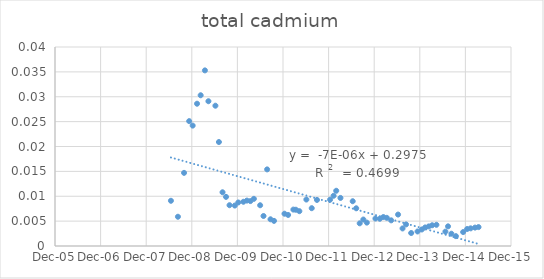
| Category | Series 0 |
|---|---|
| 39618.0 | 0.009 |
| 39674.0 | 0.006 |
| 39723.0 | 0.015 |
| 39764.0 | 0.025 |
| 39792.0 | 0.024 |
| 39827.0 | 0.029 |
| 39856.0 | 0.03 |
| 39890.0 | 0.035 |
| 39918.0 | 0.029 |
| 39974.0 | 0.028 |
| 40002.0 | 0.021 |
| 40031.0 | 0.011 |
| 40059.0 | 0.01 |
| 40087.0 | 0.008 |
| 40129.0 | 0.008 |
| 40157.0 | 0.009 |
| 40198.0 | 0.009 |
| 40226.0 | 0.009 |
| 40282.0 | 0.009 |
| 40254.0 | 0.009 |
| 40332.0 | 0.008 |
| 40359.0 | 0.006 |
| 40388.0 | 0.015 |
| 40415.0 | 0.005 |
| 40443.0 | 0.005 |
| 40527.0 | 0.006 |
| 40556.0 | 0.006 |
| 40598.0 | 0.007 |
| 40618.0 | 0.007 |
| 40646.0 | 0.007 |
| 40702.0 | 0.009 |
| 40745.0 | 0.008 |
| 40787.0 | 0.009 |
| 40892.0 | 0.009 |
| 40920.0 | 0.01 |
| 40941.0 | 0.011 |
| 40975.0 | 0.01 |
| 41073.0 | 0.009 |
| 41101.0 | 0.008 |
| 41129.0 | 0.005 |
| 41158.0 | 0.005 |
| 41186.0 | 0.005 |
| 41255.0 | 0.006 |
| 41290.0 | 0.005 |
| 41318.0 | 0.006 |
| 41346.0 | 0.006 |
| 41381.0 | 0.005 |
| 41436.0 | 0.006 |
| 41472.0 | 0.004 |
| 41500.0 | 0.004 |
| 41541.0 | 0.003 |
| 41592.0 | 0.003 |
| 41626.0 | 0.003 |
| 41653.0 | 0.004 |
| 41682.0 | 0.004 |
| 41709.0 | 0.004 |
| 41743.0 | 0.004 |
| 41815.0 | 0.003 |
| 41836.0 | 0.004 |
| 41863.0 | 0.002 |
| 41899.0 | 0.002 |
| 41957.0 | 0.003 |
| 41989.0 | 0.003 |
| 42017.0 | 0.004 |
| 42052.0 | 0.004 |
| 42080.0 | 0.004 |